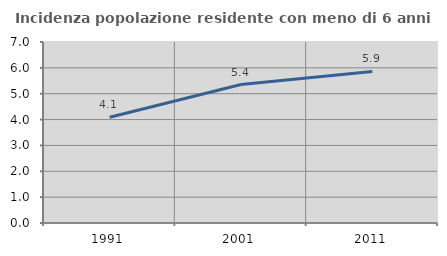
| Category | Incidenza popolazione residente con meno di 6 anni |
|---|---|
| 1991.0 | 4.088 |
| 2001.0 | 5.355 |
| 2011.0 | 5.861 |